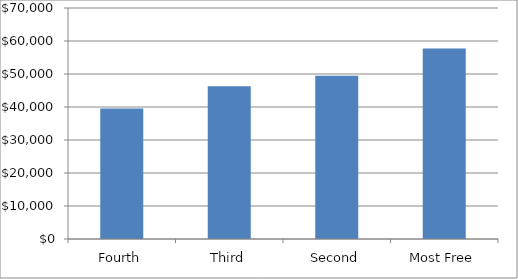
| Category | Series 0 |
|---|---|
| Fourth | 39581.798 |
| Third | 46310.407 |
| Second | 49488.505 |
| Most Free | 57743.061 |